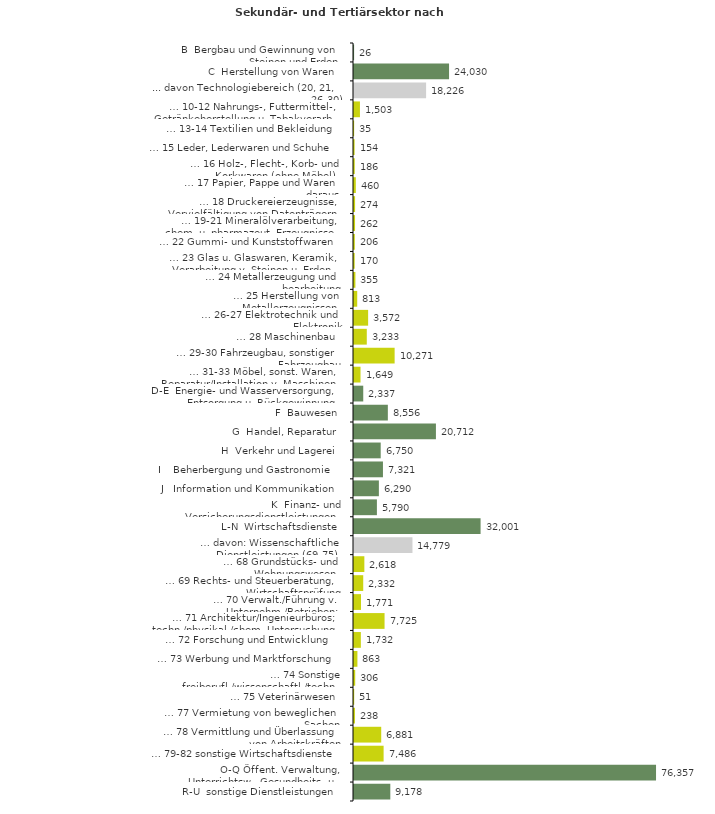
| Category | Series 0 |
|---|---|
| B  Bergbau und Gewinnung von Steinen und Erden | 26 |
| C  Herstellung von Waren | 24030 |
| ... davon Technologiebereich (20, 21, 26-30) | 18226 |
| … 10-12 Nahrungs-, Futtermittel-, Getränkeherstellung u. Tabakverarb. | 1503 |
| … 13-14 Textilien und Bekleidung | 35 |
| … 15 Leder, Lederwaren und Schuhe | 154 |
| … 16 Holz-, Flecht-, Korb- und Korkwaren (ohne Möbel)  | 186 |
| … 17 Papier, Pappe und Waren daraus  | 460 |
| … 18 Druckereierzeugnisse, Vervielfältigung von Datenträgern | 274 |
| … 19-21 Mineralölverarbeitung, chem. u. pharmazeut. Erzeugnisse | 262 |
| … 22 Gummi- und Kunststoffwaren | 206 |
| … 23 Glas u. Glaswaren, Keramik, Verarbeitung v. Steinen u. Erden  | 170 |
| … 24 Metallerzeugung und -bearbeitung | 355 |
| … 25 Herstellung von Metallerzeugnissen  | 813 |
| … 26-27 Elektrotechnik und Elektronik | 3572 |
| … 28 Maschinenbau | 3233 |
| … 29-30 Fahrzeugbau, sonstiger Fahrzeugbau | 10271 |
| … 31-33 Möbel, sonst. Waren, Reparatur/Installation v. Maschinen | 1649 |
| D-E  Energie- und Wasserversorgung, Entsorgung u. Rückgewinnung | 2337 |
| F  Bauwesen | 8556 |
| G  Handel, Reparatur | 20712 |
| H  Verkehr und Lagerei | 6750 |
| I    Beherbergung und Gastronomie | 7321 |
| J   Information und Kommunikation | 6290 |
| K  Finanz- und Versicherungsdienstleistungen | 5790 |
| L-N  Wirtschaftsdienste | 32001 |
| … davon: Wissenschaftliche Dienstleistungen (69-75) | 14779 |
| … 68 Grundstücks- und Wohnungswesen  | 2618 |
| … 69 Rechts- und Steuerberatung, Wirtschaftsprüfung | 2332 |
| … 70 Verwalt./Führung v. Unternehm./Betrieben; Unternehmensberat. | 1771 |
| … 71 Architektur/Ingenieurbüros; techn./physikal./chem. Untersuchung | 7725 |
| … 72 Forschung und Entwicklung  | 1732 |
| … 73 Werbung und Marktforschung | 863 |
| … 74 Sonstige freiberufl./wissenschaftl./techn. Tätigkeiten | 306 |
| … 75 Veterinärwesen | 51 |
| … 77 Vermietung von beweglichen Sachen  | 238 |
| … 78 Vermittlung und Überlassung von Arbeitskräften | 6881 |
| … 79-82 sonstige Wirtschaftsdienste | 7486 |
| O-Q Öffent. Verwaltung, Unterrichtsw., Gesundheits- u. Sozialwesen | 76357 |
| R-U  sonstige Dienstleistungen | 9178 |